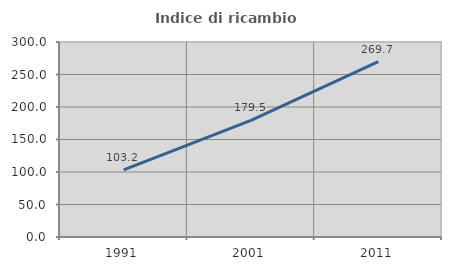
| Category | Indice di ricambio occupazionale  |
|---|---|
| 1991.0 | 103.226 |
| 2001.0 | 179.545 |
| 2011.0 | 269.697 |